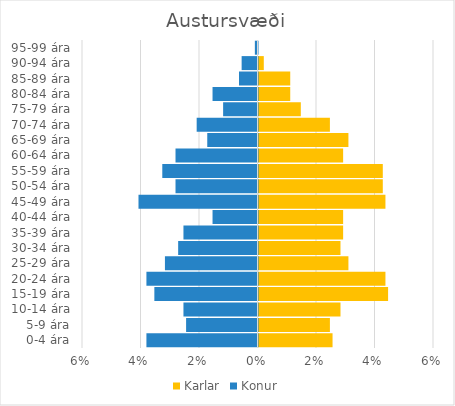
| Category | Karlar | Konur |
|---|---|---|
| 0-4 ára | 0.025 | -0.038 |
| 5-9 ára | 0.024 | -0.024 |
| 10-14 ára | 0.028 | -0.025 |
| 15-19 ára | 0.044 | -0.035 |
| 20-24 ára | 0.043 | -0.038 |
| 25-29 ára | 0.031 | -0.032 |
| 30-34 ára | 0.028 | -0.027 |
| 35-39 ára | 0.029 | -0.025 |
| 40-44 ára | 0.029 | -0.015 |
| 45-49 ára | 0.043 | -0.041 |
| 50-54 ára | 0.042 | -0.028 |
| 55-59 ára | 0.042 | -0.033 |
| 60-64 ára | 0.029 | -0.028 |
| 65-69 ára | 0.031 | -0.017 |
| 70-74 ára | 0.024 | -0.021 |
| 75-79 ára | 0.014 | -0.012 |
| 80-84 ára | 0.011 | -0.015 |
| 85-89 ára | 0.011 | -0.006 |
| 90-94 ára | 0.002 | -0.005 |
| 95-99 ára | 0 | -0.001 |